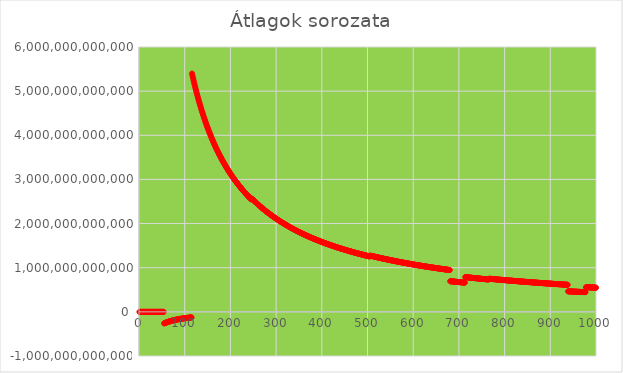
| Category | Series 0 |
|---|---|
| 1.0 | 73.342 |
| 2.0 | -8998038.1 |
| 3.0 | -5999014.146 |
| 4.0 | -4499249.959 |
| 5.0 | -3599421.677 |
| 6.0 | -2999512.402 |
| 7.0 | -2570990.551 |
| 8.0 | -2249607.826 |
| 9.0 | -1999646.416 |
| 10.0 | -1799685.333 |
| 11.0 | -1635960.629 |
| 12.0 | -1498089.171 |
| 13.0 | -1382877.016 |
| 14.0 | -1283683.801 |
| 15.0 | -1198100.523 |
| 16.0 | -1123221.568 |
| 17.0 | -1057045.702 |
| 18.0 | -1591620.521 |
| 19.0 | -1508120.52 |
| 20.0 | -1431346.783 |
| 21.0 | -1363021.76 |
| 22.0 | -1301070.196 |
| 23.0 | -1244540.46 |
| 24.0 | -1192691.345 |
| 25.0 | -1144949.747 |
| 26.0 | -1100864.348 |
| 27.0 | -1058429.316 |
| 28.0 | -844750.14 |
| 29.0 | -815525.965 |
| 30.0 | -788340.503 |
| 31.0 | -762882.119 |
| 32.0 | -739025.991 |
| 33.0 | -716621.884 |
| 34.0 | -695547.17 |
| 35.0 | -675397.177 |
| 36.0 | -656631.612 |
| 37.0 | -638881.057 |
| 38.0 | -622071.281 |
| 39.0 | -606115.889 |
| 40.0 | -590956.231 |
| 41.0 | -577149.42 |
| 42.0 | -562821.652 |
| 43.0 | -549713.29 |
| 44.0 | -537416.353 |
| 45.0 | -500046.419 |
| 46.0 | -489183.406 |
| 47.0 | -478709.487 |
| 48.0 | -468731.911 |
| 49.0 | -459166.902 |
| 50.0 | -448379.593 |
| 51.0 | -488933.9 |
| 52.0 | -479526.282 |
| 53.0 | -470481.327 |
| 54.0 | 4357511.761 |
| 55.0 | -262386377066.262 |
| 56.0 | -257700906052.723 |
| 57.0 | -253179790985.299 |
| 58.0 | -248814622174.234 |
| 59.0 | -244597425189.073 |
| 60.0 | -240520808755.395 |
| 61.0 | -236577021240.015 |
| 62.0 | -232761262849.162 |
| 63.0 | -229066639624.921 |
| 64.0 | -225487473381.436 |
| 65.0 | -222018435329.951 |
| 66.0 | -218654519638.866 |
| 67.0 | -215391064013.237 |
| 68.0 | -212223255084.763 |
| 69.0 | -209147555708.713 |
| 70.0 | -206160170025.491 |
| 71.0 | -203256505662.96 |
| 72.0 | -200433498638.749 |
| 73.0 | -197687834277.686 |
| 74.0 | -195016464765.516 |
| 75.0 | -192416245234.163 |
| 76.0 | -189884452534.172 |
| 77.0 | -187418420682.005 |
| 78.0 | -185015626460.637 |
| 79.0 | -182673656511.588 |
| 80.0 | -180390235806.14 |
| 81.0 | -178163195857.363 |
| 82.0 | -175990473953.347 |
| 83.0 | -173870106796.752 |
| 84.0 | -171800224572.114 |
| 85.0 | -169779045458.839 |
| 86.0 | -167804870508.874 |
| 87.0 | -165876078863.313 |
| 88.0 | -163984975426.407 |
| 89.0 | -162142447567.551 |
| 90.0 | -160340864780.276 |
| 91.0 | -158578877256.064 |
| 92.0 | -156855193833.895 |
| 93.0 | -155168578847.298 |
| 94.0 | -153844998663.005 |
| 95.0 | -152225577626.143 |
| 96.0 | -150639894578.554 |
| 97.0 | -149086905974.069 |
| 98.0 | -147565611012.832 |
| 99.0 | -146075049238.624 |
| 100.0 | -144614298746.612 |
| 101.0 | -143182473925.043 |
| 102.0 | -141778724179.691 |
| 103.0 | -140402231712.903 |
| 104.0 | -139052210254.796 |
| 105.0 | -137727903489.24 |
| 106.0 | -136428583642.183 |
| 107.0 | -135153550252.04 |
| 108.0 | -133902128489.962 |
| 109.0 | -132673678880.621 |
| 110.0 | -131467554507.733 |
| 111.0 | -130283162123.412 |
| 112.0 | -129119919573.157 |
| 113.0 | -127977265429.886 |
| 114.0 | -126854657811.527 |
| 115.0 | -125751573833.98 |
| 116.0 | 5397983727469.142 |
| 117.0 | 5351847114414.734 |
| 118.0 | 5306492478497.487 |
| 119.0 | 5261900104671.265 |
| 120.0 | 5218050937064.551 |
| 121.0 | 5174926549151.6 |
| 122.0 | 5132509118419.924 |
| 123.0 | 5090781402013.877 |
| 124.0 | 5049726713419.926 |
| 125.0 | 5009328899712.873 |
| 126.0 | 4969572321145.022 |
| 127.0 | 4930440337955.985 |
| 128.0 | 4891921272796.426 |
| 129.0 | 4853999755832.431 |
| 130.0 | 4816661379137.787 |
| 131.0 | 4779892971664.072 |
| 132.0 | 4743681661309.508 |
| 133.0 | 4708014881899.278 |
| 134.0 | 4672880442481.731 |
| 135.0 | 4638266513305.288 |
| 136.0 | 4604161612471.637 |
| 137.0 | 4570554593402.205 |
| 138.0 | 4537434632580.184 |
| 139.0 | 4504791217932.449 |
| 140.0 | 4472614137802.77 |
| 141.0 | 4440893470179.281 |
| 142.0 | 4409619572499.104 |
| 143.0 | 4378783071991.268 |
| 144.0 | 4348374856215.236 |
| 145.0 | 4318386064094.248 |
| 146.0 | 4288808077351.957 |
| 147.0 | 4259632512199.34 |
| 148.0 | 4230851211434.974 |
| 149.0 | 4202456236464.265 |
| 150.0 | 4174439861552.498 |
| 151.0 | 4146794564455.012 |
| 152.0 | 4119513021267.414 |
| 153.0 | 4092588099217.041 |
| 154.0 | 4066020023198.587 |
| 155.0 | 4039787635954.171 |
| 156.0 | 4013891561365.581 |
| 157.0 | 3988325372709.927 |
| 158.0 | 3963082807116.288 |
| 159.0 | 3938157758017.227 |
| 160.0 | 3913599908199.745 |
| 161.0 | 3889291834268.379 |
| 162.0 | 3865283836275.48 |
| 163.0 | 3841570438570.354 |
| 164.0 | 3818146232609.882 |
| 165.0 | 3795005952413.116 |
| 166.0 | 3772144470764.542 |
| 167.0 | 3749556776431.381 |
| 168.0 | 3727237987327.398 |
| 169.0 | 3705183324649.391 |
| 170.0 | 3683388128621.533 |
| 171.0 | 3661847847111.803 |
| 172.0 | 3640558034046.778 |
| 173.0 | 3619514345988.398 |
| 174.0 | 3598712539399.7 |
| 175.0 | 3578148467740.106 |
| 176.0 | 3557818078737.189 |
| 177.0 | 3537717411626.007 |
| 178.0 | 3517842592185.361 |
| 179.0 | 3498189840272.44 |
| 180.0 | 3478755452069.682 |
| 181.0 | 3459535808683.952 |
| 182.0 | 3440527370182.572 |
| 183.0 | 3421726674169.874 |
| 184.0 | 3403130333556.752 |
| 185.0 | 3384735034457.412 |
| 186.0 | 3366537534275.806 |
| 187.0 | 3348534659754.692 |
| 188.0 | 3330723305182.617 |
| 189.0 | 3313100430599.858 |
| 190.0 | 3295663059912.712 |
| 191.0 | 3278408268570.162 |
| 192.0 | 3261333225504.036 |
| 193.0 | 3244435125878.041 |
| 194.0 | 3227711233526.853 |
| 195.0 | 3211158868404.302 |
| 196.0 | 3194775404741.436 |
| 197.0 | 3178558270708.042 |
| 198.0 | 3162504946116.596 |
| 199.0 | 3146612961463.102 |
| 200.0 | 3130876446889.433 |
| 201.0 | 3115299943886.097 |
| 202.0 | 3099877666937.98 |
| 203.0 | 3084607278644.933 |
| 204.0 | 3069486664127.23 |
| 205.0 | 3054513558451.238 |
| 206.0 | 3039685822743.598 |
| 207.0 | 3025001367865.056 |
| 208.0 | 3010458092058.43 |
| 209.0 | 2996053986353.41 |
| 210.0 | 2981787062607.752 |
| 211.0 | 2967655370389.846 |
| 212.0 | 2953656996001.612 |
| 213.0 | 2939790062069.989 |
| 214.0 | 2926052752964.064 |
| 215.0 | 2912443205275.602 |
| 216.0 | 2898959672617.344 |
| 217.0 | 2885603853096.646 |
| 218.0 | 2872367138176.392 |
| 219.0 | 2859251306495.66 |
| 220.0 | 2846254709660.978 |
| 221.0 | 2833375733509.001 |
| 222.0 | 2820612779754.172 |
| 223.0 | 2807964291952.398 |
| 224.0 | 2795428734820.246 |
| 225.0 | 2783004607110.114 |
| 226.0 | 2770690427360.097 |
| 227.0 | 2758484742620.754 |
| 228.0 | 2746386125303.002 |
| 229.0 | 2734393172807.052 |
| 230.0 | 2722504507507.942 |
| 231.0 | 2710718773711.181 |
| 232.0 | 2699034641574.998 |
| 233.0 | 2687450801911.046 |
| 234.0 | 2675965969424.045 |
| 235.0 | 2664578880180.584 |
| 236.0 | 2653288291700.229 |
| 237.0 | 2642092982452.686 |
| 238.0 | 2630991751428.846 |
| 239.0 | 2619983417812.022 |
| 240.0 | 2609066820237.095 |
| 241.0 | 2598240812415.546 |
| 242.0 | 2587504280297.222 |
| 243.0 | 2576856114630.326 |
| 244.0 | 2566295227903.886 |
| 245.0 | 2555820553466.376 |
| 246.0 | 2545431039021.766 |
| 247.0 | 2564768930865.873 |
| 248.0 | 2554427120660.556 |
| 249.0 | 2544168377271.131 |
| 250.0 | 2533991703761.744 |
| 251.0 | 2523896097991.576 |
| 252.0 | 2513880637303.108 |
| 253.0 | 2503944350018.5 |
| 254.0 | 2494086301396.686 |
| 255.0 | 2484305570803.765 |
| 256.0 | 2474601252167.584 |
| 257.0 | 2464972461401.27 |
| 258.0 | 2455418304574.277 |
| 259.0 | 2445937924986.912 |
| 260.0 | 2436530402833.291 |
| 261.0 | 2427195037305.387 |
| 262.0 | 2417930934109.443 |
| 263.0 | 2408737280366.741 |
| 264.0 | 2399613275515.969 |
| 265.0 | 2390558131081.08 |
| 266.0 | 2381571070356.842 |
| 267.0 | 2372651328520.498 |
| 268.0 | 2363798152164.029 |
| 269.0 | 2355010800597.302 |
| 270.0 | 2346288538372.21 |
| 271.0 | 2337630647087.338 |
| 272.0 | 2329036416782.69 |
| 273.0 | 2320505147854.29 |
| 274.0 | 2312036153587.129 |
| 275.0 | 2303628749372.106 |
| 276.0 | 2295282268394.304 |
| 277.0 | 2286996050811.569 |
| 278.0 | 2278769446313.469 |
| 279.0 | 2270601813917.55 |
| 280.0 | 2262492521725.552 |
| 281.0 | 2254440947833.048 |
| 282.0 | 2246446753499.216 |
| 283.0 | 2238508779107.078 |
| 284.0 | 2230626705940.878 |
| 285.0 | 2222799945568.715 |
| 286.0 | 2215027917912.764 |
| 287.0 | 2207310050616.452 |
| 288.0 | 2199645617392.599 |
| 289.0 | 2192034385920.852 |
| 290.0 | 2184475646659.401 |
| 291.0 | 2176968857496.887 |
| 292.0 | 2169513484697.657 |
| 293.0 | 2162109001814.576 |
| 294.0 | 2154754887112.224 |
| 295.0 | 2147436394323.688 |
| 296.0 | 2140181541966.119 |
| 297.0 | 2132975543600.007 |
| 298.0 | 2125817907548.151 |
| 299.0 | 2118708148568.608 |
| 300.0 | 2111645788073.234 |
| 301.0 | 2104630287790.575 |
| 302.0 | 2097722413022.237 |
| 303.0 | 2090799236576.394 |
| 304.0 | 2083921606792.54 |
| 305.0 | 2077089032541.218 |
| 306.0 | 2070301159800.599 |
| 307.0 | 2063557505467.542 |
| 308.0 | 2056857643451.932 |
| 309.0 | 2050201146217.658 |
| 310.0 | 2043587594139.289 |
| 311.0 | 2037016572934.343 |
| 312.0 | 2030487670653.681 |
| 313.0 | 2024000489599.132 |
| 314.0 | 2017554628178.845 |
| 315.0 | 2011149692851.431 |
| 316.0 | 2004785295091.542 |
| 317.0 | 1998461051258.559 |
| 318.0 | 1992176582544.025 |
| 319.0 | 1985931514893.847 |
| 320.0 | 1979725478910.567 |
| 321.0 | 1973558109817.272 |
| 322.0 | 1967428990758.899 |
| 323.0 | 1961337876574.23 |
| 324.0 | 1955284364609.046 |
| 325.0 | 1949268105024.578 |
| 326.0 | 1943288754895.08 |
| 327.0 | 1937345975829.956 |
| 328.0 | 1931439433221.534 |
| 329.0 | 1925568714399.344 |
| 330.0 | 1919733657685.824 |
| 331.0 | 1913933858115.642 |
| 332.0 | 1908168997098.807 |
| 333.0 | 1902438759870.165 |
| 334.0 | 1896744287729.766 |
| 335.0 | 1891082364483.052 |
| 336.0 | 1885454143160.648 |
| 337.0 | 1879859326910.412 |
| 338.0 | 1874297612925.042 |
| 339.0 | 1868768712447.358 |
| 340.0 | 1863272333881.189 |
| 341.0 | 1857808192184.058 |
| 342.0 | 1852376004487.094 |
| 343.0 | 1846975491357.143 |
| 344.0 | 1841606376550.632 |
| 345.0 | 1836268387042.716 |
| 346.0 | 1830961252954.969 |
| 347.0 | 1825684707556.366 |
| 348.0 | 1820438487132.822 |
| 349.0 | 1815188329571.586 |
| 350.0 | 1810002077171.247 |
| 351.0 | 1804845375473.727 |
| 352.0 | 1799717973623.124 |
| 353.0 | 1794619622422.74 |
| 354.0 | 1789550075469.154 |
| 355.0 | 1784509089340.464 |
| 356.0 | 1779496423613.761 |
| 357.0 | 1774511839794.366 |
| 358.0 | 1769555102811.869 |
| 359.0 | 1764625979962.704 |
| 360.0 | 1759724241129.191 |
| 361.0 | 1754849658727.57 |
| 362.0 | 1750002007738.014 |
| 363.0 | 1745181072868.02 |
| 364.0 | 1740386619371.256 |
| 365.0 | 1735618434119.22 |
| 366.0 | 1730876307249.609 |
| 367.0 | 1726160023033.432 |
| 368.0 | 1721469370801.174 |
| 369.0 | 1716804142154.139 |
| 370.0 | 1712164130959.405 |
| 371.0 | 1707549133571.436 |
| 372.0 | 1702958947728.659 |
| 373.0 | 1698393374142.644 |
| 374.0 | 1693852215388.088 |
| 375.0 | 1689335276146.924 |
| 376.0 | 1684842363178.072 |
| 377.0 | 1680373285291.53 |
| 378.0 | 1675927853323.29 |
| 379.0 | 1671505880000.44 |
| 380.0 | 1667095279737.652 |
| 381.0 | 1662719701575.081 |
| 382.0 | 1658367032199.4 |
| 383.0 | 1654037092168.224 |
| 384.0 | 1649729703923.768 |
| 385.0 | 1645444697332.129 |
| 386.0 | 1641181887236.101 |
| 387.0 | 1636941107102.062 |
| 388.0 | 1632722186814.764 |
| 389.0 | 1628524957543.318 |
| 390.0 | 1624344505246.302 |
| 391.0 | 1620189607919.889 |
| 392.0 | 1616056471165.123 |
| 393.0 | 1611944368075.876 |
| 394.0 | 1607853138716.927 |
| 395.0 | 1603782626364.268 |
| 396.0 | 1599732656337.475 |
| 397.0 | 1595703103046.749 |
| 398.0 | 1591693798751.591 |
| 399.0 | 1587704591235.813 |
| 400.0 | 1583735329757.932 |
| 401.0 | 1579785865095.082 |
| 402.0 | 1575856048567.197 |
| 403.0 | 1571945735795.886 |
| 404.0 | 1568054781003.474 |
| 405.0 | 1564183196652.079 |
| 406.0 | 1560330528679.838 |
| 407.0 | 1556496792736.68 |
| 408.0 | 1552681849585.264 |
| 409.0 | 1548885561385.47 |
| 410.0 | 1545107789156.483 |
| 411.0 | 1541348402805.609 |
| 412.0 | 1537607265905.496 |
| 413.0 | 1533884245873.795 |
| 414.0 | 1530613185482.69 |
| 415.0 | 1526924960938.615 |
| 416.0 | 1523254468250.756 |
| 417.0 | 1519601579935.001 |
| 418.0 | 1515966169455.222 |
| 419.0 | 1512348111772.216 |
| 420.0 | 1508747285698.353 |
| 421.0 | 1505163562992.411 |
| 422.0 | 1501596824692.308 |
| 423.0 | 1498046950381.701 |
| 424.0 | 1494513820780.612 |
| 425.0 | 1490997317672.79 |
| 426.0 | 1487497323969.478 |
| 427.0 | 1484013723662.732 |
| 428.0 | 1480546401685.472 |
| 429.0 | 1477095244571.671 |
| 430.0 | 1473660139332.906 |
| 431.0 | 1470240974275.552 |
| 432.0 | 1466837638694.358 |
| 433.0 | 1463450022900.122 |
| 434.0 | 1460077121124.625 |
| 435.0 | 1456720621995.818 |
| 436.0 | 1453379519669.22 |
| 437.0 | 1450053709052.778 |
| 438.0 | 1446743084146.38 |
| 439.0 | 1443447541815.406 |
| 440.0 | 1440166979220.732 |
| 441.0 | 1436901294239.186 |
| 442.0 | 1433650386373.023 |
| 443.0 | 1430414154672.335 |
| 444.0 | 1427192501171.242 |
| 445.0 | 1423985326988.814 |
| 446.0 | 1420792534809.414 |
| 447.0 | 1417614028004.997 |
| 448.0 | 1414449710976.056 |
| 449.0 | 1411299488904.477 |
| 450.0 | 1408163231578.41 |
| 451.0 | 1405040918426.465 |
| 452.0 | 1401932420822.705 |
| 453.0 | 1398837647265.896 |
| 454.0 | 1395756508749.116 |
| 455.0 | 1392688911994.651 |
| 456.0 | 1389634769643.21 |
| 457.0 | 1386593993341.736 |
| 458.0 | 1383566495539.992 |
| 459.0 | 1380552189448.95 |
| 460.0 | 1377550990423.711 |
| 461.0 | 1374562810400.501 |
| 462.0 | 1371587566221.774 |
| 463.0 | 1368625174067.588 |
| 464.0 | 1365675554519.104 |
| 465.0 | 1362738617827.061 |
| 466.0 | 1359814287515.756 |
| 467.0 | 1356902479451.113 |
| 468.0 | 1354003115182.906 |
| 469.0 | 1351116114933.584 |
| 470.0 | 1348241400385.479 |
| 471.0 | 1345378892104.297 |
| 472.0 | 1342528513104.192 |
| 473.0 | 1339690186438.568 |
| 474.0 | 1336863835845.883 |
| 475.0 | 1334049385524.969 |
| 476.0 | 1331246760765.256 |
| 477.0 | 1328455887040.961 |
| 478.0 | 1325676690956.205 |
| 479.0 | 1322909098872.188 |
| 480.0 | 1320153038245.626 |
| 481.0 | 1317408437334.638 |
| 482.0 | 1314675224424.842 |
| 483.0 | 1311953329550.16 |
| 484.0 | 1309242682174.945 |
| 485.0 | 1306543212728.152 |
| 486.0 | 1303854852205.114 |
| 487.0 | 1301177532180.643 |
| 488.0 | 1298512958491.621 |
| 489.0 | 1295857512768.557 |
| 490.0 | 1293212905596.186 |
| 491.0 | 1290579070890.12 |
| 492.0 | 1287955942697.422 |
| 493.0 | 1285343455999.864 |
| 494.0 | 1282741546170.715 |
| 495.0 | 1280150149106.576 |
| 496.0 | 1277569201225.521 |
| 497.0 | 1274998639452.762 |
| 498.0 | 1272438401221.056 |
| 499.0 | 1269888424464.47 |
| 500.0 | 1267348647615.987 |
| 501.0 | 1264819009612.35 |
| 502.0 | 1262330439162.158 |
| 503.0 | 1259820835903.695 |
| 504.0 | 1257321191392.295 |
| 505.0 | 1254831446458.72 |
| 506.0 | 1273962191770.737 |
| 507.0 | 1271449445830.475 |
| 508.0 | 1268946592577.475 |
| 509.0 | 1266453573727.13 |
| 510.0 | 1263970331424.751 |
| 511.0 | 1261496808286.142 |
| 512.0 | 1259032947332.565 |
| 513.0 | 1256578692143.526 |
| 514.0 | 1254133986516.674 |
| 515.0 | 1251698774891.626 |
| 516.0 | 1249273002077.995 |
| 517.0 | 1246856613292.244 |
| 518.0 | 1244449554193.07 |
| 519.0 | 1242051770851.987 |
| 520.0 | 1239663209749.53 |
| 521.0 | 1237283817792.404 |
| 522.0 | 1234913542279.538 |
| 523.0 | 1232552330917.55 |
| 524.0 | 1230200131813.004 |
| 525.0 | 1227856903334.398 |
| 526.0 | 1225522574620.451 |
| 527.0 | 1223197104839.311 |
| 528.0 | 1220880443653.867 |
| 529.0 | 1218572541200.403 |
| 530.0 | 1216273347724.759 |
| 531.0 | 1213982814115.262 |
| 532.0 | 1211700891531.226 |
| 533.0 | 1209427531508.38 |
| 534.0 | 1207162685943.842 |
| 535.0 | 1204906308191.369 |
| 536.0 | 1202658348588.884 |
| 537.0 | 1200418761348.163 |
| 538.0 | 1198187485341.89 |
| 539.0 | 1195964502994.188 |
| 540.0 | 1193749753913.726 |
| 541.0 | 1191543192445.152 |
| 542.0 | 1189344773273.959 |
| 543.0 | 1187154451381.456 |
| 544.0 | 1184972182168.528 |
| 545.0 | 1182797921429.949 |
| 546.0 | 1180631624874.101 |
| 547.0 | 1178473249068.412 |
| 548.0 | 1176322750437.514 |
| 549.0 | 1174180086046.134 |
| 550.0 | 1172045213162.685 |
| 551.0 | 1169918089365.726 |
| 552.0 | 1167798672537.031 |
| 553.0 | 1165686920868.428 |
| 554.0 | 1163582792852.55 |
| 555.0 | 1161486247278.584 |
| 556.0 | 1159397243236.646 |
| 557.0 | 1157315740106.524 |
| 558.0 | 1155241697561.962 |
| 559.0 | 1153175075563.118 |
| 560.0 | 1151115834356.819 |
| 561.0 | 1149063934474.621 |
| 562.0 | 1147019336727.315 |
| 563.0 | 1144982003204.82 |
| 564.0 | 1142951893269.689 |
| 565.0 | 1140928969564.471 |
| 566.0 | 1138913193998.247 |
| 567.0 | 1136904528743.547 |
| 568.0 | 1134902936259.418 |
| 569.0 | 1132908379251.176 |
| 570.0 | 1130920820664.79 |
| 571.0 | 1128940223781.042 |
| 572.0 | 1126966552056.266 |
| 573.0 | 1124999769241.496 |
| 574.0 | 1123039839330.602 |
| 575.0 | 1121086726566.606 |
| 576.0 | 1119140286894.25 |
| 577.0 | 1117200702341.778 |
| 578.0 | 1115267805628.668 |
| 579.0 | 1113341609072.826 |
| 580.0 | 1111422054574.532 |
| 581.0 | 1109509082489.978 |
| 582.0 | 1107602709497.049 |
| 583.0 | 1105702876199.025 |
| 584.0 | 1103809549421.821 |
| 585.0 | 1101924914622.141 |
| 586.0 | 1100044496688.912 |
| 587.0 | 1098170485621.636 |
| 588.0 | 1096302848741.261 |
| 589.0 | 1094441553577.725 |
| 590.0 | 1092586567893.59 |
| 591.0 | 1090737902418.836 |
| 592.0 | 1088895383550.543 |
| 593.0 | 1086856530261.449 |
| 594.0 | 1085026805470.634 |
| 595.0 | 1083203231005.711 |
| 596.0 | 1081385775818.157 |
| 597.0 | 1079574409252.094 |
| 598.0 | 1077769100821.079 |
| 599.0 | 1075969820185.177 |
| 600.0 | 1074176537151.089 |
| 601.0 | 1072389221731.496 |
| 602.0 | 1070607844260.669 |
| 603.0 | 1068832375199.203 |
| 604.0 | 1067062785184.864 |
| 605.0 | 1065299046423.6 |
| 606.0 | 1063541127204.366 |
| 607.0 | 1061789000149.629 |
| 608.0 | 1060042636662.475 |
| 609.0 | 1058302008358.256 |
| 610.0 | 1056567061890.076 |
| 611.0 | 1054837820173.019 |
| 612.0 | 1053114228812.043 |
| 613.0 | 1051396261062.646 |
| 614.0 | 1049683889301.75 |
| 615.0 | 1047977086006.4 |
| 616.0 | 1046275824505.237 |
| 617.0 | 1044580077625.826 |
| 618.0 | 1042889818759.346 |
| 619.0 | 1041205021008.037 |
| 620.0 | 1039525657682.943 |
| 621.0 | 1037851703319.739 |
| 622.0 | 1036183131452.664 |
| 623.0 | 1034519916153.898 |
| 624.0 | 1032862031672.553 |
| 625.0 | 1031209452421.668 |
| 626.0 | 1029562142934.125 |
| 627.0 | 1027920098048.946 |
| 628.0 | 1026283190882.082 |
| 629.0 | 1024651481784.282 |
| 630.0 | 1023025050862.3 |
| 631.0 | 1021403775028.69 |
| 632.0 | 1019787629815.143 |
| 633.0 | 1018176590906.074 |
| 634.0 | 1016570634132.92 |
| 635.0 | 1014969735497.728 |
| 636.0 | 1013373872432.222 |
| 637.0 | 1011783018620.187 |
| 638.0 | 1010197151820.008 |
| 639.0 | 1008616248607.076 |
| 640.0 | 1007040285710.695 |
| 641.0 | 1005469240023.265 |
| 642.0 | 1003903088596.232 |
| 643.0 | 1002341808520.531 |
| 644.0 | 1000785377007.16 |
| 645.0 | 999233771771.435 |
| 646.0 | 997686970271.946 |
| 647.0 | 996144950224.467 |
| 648.0 | 994607689498.352 |
| 649.0 | 993075166093.826 |
| 650.0 | 991547357798.681 |
| 651.0 | 990024243736.733 |
| 652.0 | 988505801645.168 |
| 653.0 | 986992010217.962 |
| 654.0 | 985482848122.912 |
| 655.0 | 983978294574.49 |
| 656.0 | 982478327625.218 |
| 657.0 | 980982926821.966 |
| 658.0 | 979492071175.832 |
| 659.0 | 978005740263.748 |
| 660.0 | 976523913317.994 |
| 661.0 | 975046563605.345 |
| 662.0 | 973573683599.752 |
| 663.0 | 972105246671.068 |
| 664.0 | 970641232737.676 |
| 665.0 | 969181621862.946 |
| 666.0 | 967726394201.339 |
| 667.0 | 966275530041.863 |
| 668.0 | 964829009787.25 |
| 669.0 | 963386813958.211 |
| 670.0 | 961948923188.73 |
| 671.0 | 960556592990.85 |
| 672.0 | 959127193299.194 |
| 673.0 | 957702040509.376 |
| 674.0 | 956281117600.886 |
| 675.0 | 954864404838.822 |
| 676.0 | 953451883528.875 |
| 677.0 | 952043535100.323 |
| 678.0 | 950639340754.733 |
| 679.0 | 949239282815.54 |
| 680.0 | 947843342693.67 |
| 681.0 | 693500663028.834 |
| 682.0 | 692483799578.022 |
| 683.0 | 691469914070.238 |
| 684.0 | 690459183389.008 |
| 685.0 | 689451213790.817 |
| 686.0 | 688446182930.409 |
| 687.0 | 687444077863.276 |
| 688.0 | 686444885888.467 |
| 689.0 | 685448594320.03 |
| 690.0 | 684455190560.091 |
| 691.0 | 683464662062.313 |
| 692.0 | 682476996365.436 |
| 693.0 | 681492181373.77 |
| 694.0 | 680510204350.04 |
| 695.0 | 679531052981.614 |
| 696.0 | 678554715260.542 |
| 697.0 | 677581178643.427 |
| 698.0 | 676610428730.495 |
| 699.0 | 675642459637.818 |
| 700.0 | 674677256124.102 |
| 701.0 | 673733051315.281 |
| 702.0 | 672773317623.868 |
| 703.0 | 671816314327.026 |
| 704.0 | 670862029796.827 |
| 705.0 | 669910452449.525 |
| 706.0 | 668961570788.533 |
| 707.0 | 668015373375.621 |
| 708.0 | 667071848850.254 |
| 709.0 | 666130985871.639 |
| 710.0 | 665192773220.394 |
| 711.0 | 664257199719.427 |
| 712.0 | 663326388114.981 |
| 713.0 | 662396041620.549 |
| 714.0 | 787054155619.51 |
| 715.0 | 785953380576.597 |
| 716.0 | 784855680324.303 |
| 717.0 | 783761041996.763 |
| 718.0 | 782669452791.418 |
| 719.0 | 781580900173.803 |
| 720.0 | 780495371145.231 |
| 721.0 | 779412853293.383 |
| 722.0 | 778333334106.281 |
| 723.0 | 777256801140.798 |
| 724.0 | 776183242022.912 |
| 725.0 | 775112644448.424 |
| 726.0 | 774044996178.669 |
| 727.0 | 772980285044.568 |
| 728.0 | 771918498938.678 |
| 729.0 | 770859625809.329 |
| 730.0 | 769803456198.204 |
| 731.0 | 768750373495.049 |
| 732.0 | 767700168066.39 |
| 733.0 | 766652828066.728 |
| 734.0 | 765608341976.132 |
| 735.0 | 764566697973.858 |
| 736.0 | 763527884525.145 |
| 737.0 | 762491890147.538 |
| 738.0 | 761458703304.982 |
| 739.0 | 760428312639.034 |
| 740.0 | 759400706802.226 |
| 741.0 | 758375874539.466 |
| 742.0 | 757353695192.1 |
| 743.0 | 756334376625.166 |
| 744.0 | 755317798257.445 |
| 745.0 | 753096661448.869 |
| 746.0 | 752087147951.017 |
| 747.0 | 751080337846.441 |
| 748.0 | 750076219747.984 |
| 749.0 | 749074782872.552 |
| 750.0 | 748076016495.477 |
| 751.0 | 747079909932.005 |
| 752.0 | 746086452605.482 |
| 753.0 | 745095633943.234 |
| 754.0 | 744107443445.227 |
| 755.0 | 743121870668.497 |
| 756.0 | 742138905231.285 |
| 757.0 | 741158536795.644 |
| 758.0 | 740180755083.055 |
| 759.0 | 739205549911.845 |
| 760.0 | 738232911030.452 |
| 761.0 | 737262828362.228 |
| 762.0 | 736295291842.008 |
| 763.0 | 735330291465.844 |
| 764.0 | 734367817253.266 |
| 765.0 | 733407859329.818 |
| 766.0 | 750775522414.031 |
| 767.0 | 749796675579.029 |
| 768.0 | 748820377823.561 |
| 769.0 | 747846619204.292 |
| 770.0 | 746875389828.882 |
| 771.0 | 745906679847.411 |
| 772.0 | 744940479482.614 |
| 773.0 | 743976778991.488 |
| 774.0 | 743015568715.811 |
| 775.0 | 742056838949.88 |
| 776.0 | 741100580134.38 |
| 777.0 | 740146782734.045 |
| 778.0 | 739195437260.889 |
| 779.0 | 738246534443.073 |
| 780.0 | 737300064527.068 |
| 781.0 | 736356018346.912 |
| 782.0 | 735414386399.653 |
| 783.0 | 734475154084.747 |
| 784.0 | 733538323536.355 |
| 785.0 | 732603879811.802 |
| 786.0 | 731671813804.969 |
| 787.0 | 730742116453.673 |
| 788.0 | 729814778742.138 |
| 789.0 | 728889791676.878 |
| 790.0 | 727967146376.734 |
| 791.0 | 727046833945.26 |
| 792.0 | 726128844863.718 |
| 793.0 | 725213172071.898 |
| 794.0 | 724299710779.524 |
| 795.0 | 723388641961.311 |
| 796.0 | 722479878164.912 |
| 797.0 | 721573378437.761 |
| 798.0 | 720669151150.313 |
| 799.0 | 719767187256.392 |
| 800.0 | 718867478268.672 |
| 801.0 | 717970076931.936 |
| 802.0 | 717074852369.147 |
| 803.0 | 716181857534.371 |
| 804.0 | 715291084079.636 |
| 805.0 | 714402523726.803 |
| 806.0 | 713516344241.039 |
| 807.0 | 712632185202.405 |
| 808.0 | 711750214675.966 |
| 809.0 | 710870448599.959 |
| 810.0 | 709992830762.753 |
| 811.0 | 709117377210.699 |
| 812.0 | 708244079949.394 |
| 813.0 | 707372931019.48 |
| 814.0 | 706503922504.644 |
| 815.0 | 705637046534.775 |
| 816.0 | 704772295250.047 |
| 817.0 | 703909660871.176 |
| 818.0 | 703049135612.944 |
| 819.0 | 702190711759.602 |
| 820.0 | 701334381623.594 |
| 821.0 | 700480137552.783 |
| 822.0 | 699627971934.681 |
| 823.0 | 698777877193.714 |
| 824.0 | 697929845789.399 |
| 825.0 | 697083870198.589 |
| 826.0 | 696239942993.976 |
| 827.0 | 695398056726.299 |
| 828.0 | 694558204011.979 |
| 829.0 | 693720377469.293 |
| 830.0 | 692884569787.315 |
| 831.0 | 692050773666.519 |
| 832.0 | 691218981890.268 |
| 833.0 | 690389187669.95 |
| 834.0 | 689561397059.722 |
| 835.0 | 688735575025.848 |
| 836.0 | 687911728644.178 |
| 837.0 | 687089850832.133 |
| 838.0 | 686269934542.281 |
| 839.0 | 685451972760.779 |
| 840.0 | 684635958506.501 |
| 841.0 | 683821884833.848 |
| 842.0 | 683009744828.042 |
| 843.0 | 682199531607.716 |
| 844.0 | 681391214405.398 |
| 845.0 | 680581772392.101 |
| 846.0 | 679777302211.854 |
| 847.0 | 678974731607.561 |
| 848.0 | 678174053857.986 |
| 849.0 | 677375262274.952 |
| 850.0 | 676578350201.887 |
| 851.0 | 675783311017.598 |
| 852.0 | 674990138117.292 |
| 853.0 | 674198824067.646 |
| 854.0 | 673409364086.241 |
| 855.0 | 672621750795.25 |
| 856.0 | 671835977717.552 |
| 857.0 | 671052038157.732 |
| 858.0 | 670269926224.382 |
| 859.0 | 669489636360.774 |
| 860.0 | 668711160057.909 |
| 861.0 | 667934492044.674 |
| 862.0 | 667159634594.414 |
| 863.0 | 666386564335.581 |
| 864.0 | 665615283589.768 |
| 865.0 | 664845786147.166 |
| 866.0 | 664078065839.892 |
| 867.0 | 663312116496.715 |
| 868.0 | 662547932031.661 |
| 869.0 | 661785506432.535 |
| 870.0 | 661024834358.168 |
| 871.0 | 660266760206.397 |
| 872.0 | 659509361171.297 |
| 873.0 | 658753909476.889 |
| 874.0 | 658000178688.414 |
| 875.0 | 657248178484.883 |
| 876.0 | 656497895176.239 |
| 877.0 | 655749322889.93 |
| 878.0 | 655002455779.529 |
| 879.0 | 654257272959.593 |
| 880.0 | 653513798785.198 |
| 881.0 | 652772012406.439 |
| 882.0 | 652031908086.503 |
| 883.0 | 651293480103.648 |
| 884.0 | 650556722788.938 |
| 885.0 | 649821630479.22 |
| 886.0 | 649088196178.194 |
| 887.0 | 648356416743.214 |
| 888.0 | 647626285643.358 |
| 889.0 | 646897797132.578 |
| 890.0 | 646170945639.761 |
| 891.0 | 645445726991.219 |
| 892.0 | 644722133119.716 |
| 893.0 | 644000159846.3 |
| 894.0 | 643279801725.389 |
| 895.0 | 642561053343.024 |
| 896.0 | 641843993884.219 |
| 897.0 | 641128446881.218 |
| 898.0 | 640414495381.436 |
| 899.0 | 639702132716.656 |
| 900.0 | 638991350522.72 |
| 901.0 | 638282148135.172 |
| 902.0 | 637574518259.146 |
| 903.0 | 636868455669.756 |
| 904.0 | 636163955155.958 |
| 905.0 | 635461011557.408 |
| 906.0 | 634759619710.243 |
| 907.0 | 634059774483.966 |
| 908.0 | 633361470767.335 |
| 909.0 | 632664703472.677 |
| 910.0 | 631969494730.924 |
| 911.0 | 631275788010.094 |
| 912.0 | 630583599646.094 |
| 913.0 | 629892927576.276 |
| 914.0 | 629203766824.053 |
| 915.0 | 628516112431.669 |
| 916.0 | 627829959470.31 |
| 917.0 | 627145303026.38 |
| 918.0 | 626462138219.45 |
| 919.0 | 625780460158.203 |
| 920.0 | 625100264005.155 |
| 921.0 | 624421540370.466 |
| 922.0 | 623744293577.261 |
| 923.0 | 623068514948.366 |
| 924.0 | 622394198373.82 |
| 925.0 | 621721339781.039 |
| 926.0 | 621049934434.557 |
| 927.0 | 620379977676.796 |
| 928.0 | 619711464769.683 |
| 929.0 | 619044391153.307 |
| 930.0 | 618378745970.697 |
| 931.0 | 617714536791.391 |
| 932.0 | 617051752929.981 |
| 933.0 | 616390389860.405 |
| 934.0 | 615730442977.479 |
| 935.0 | 615071747433.493 |
| 936.0 | 614414619494.469 |
| 937.0 | 613758894204.76 |
| 938.0 | 613104567025.472 |
| 939.0 | 465329107876.825 |
| 940.0 | 464834076820.422 |
| 941.0 | 464340097992.942 |
| 942.0 | 463847167952.417 |
| 943.0 | 463355283368.163 |
| 944.0 | 462864440906.872 |
| 945.0 | 461977881009.693 |
| 946.0 | 461489532305.43 |
| 947.0 | 461002214953.376 |
| 948.0 | 460515925695.79 |
| 949.0 | 460030661293.857 |
| 950.0 | 459546418492.23 |
| 951.0 | 459063193744.578 |
| 952.0 | 458580984507.281 |
| 953.0 | 458099787251.722 |
| 954.0 | 457619598795.407 |
| 955.0 | 457140415954.027 |
| 956.0 | 456662235608.851 |
| 957.0 | 456185054593.008 |
| 958.0 | 455708869775.585 |
| 959.0 | 455233678044.663 |
| 960.0 | 454759554829.991 |
| 961.0 | 454286339892.652 |
| 962.0 | 453814108821.781 |
| 963.0 | 453342863530.587 |
| 964.0 | 452872590848.54 |
| 965.0 | 452403292738.198 |
| 966.0 | 451934966144.249 |
| 967.0 | 451467608134.401 |
| 968.0 | 451001216022.725 |
| 969.0 | 450535786491.281 |
| 970.0 | 450071316004.721 |
| 971.0 | 449607802802.658 |
| 972.0 | 449145243341.615 |
| 973.0 | 448683634663.791 |
| 974.0 | 448372857585.202 |
| 975.0 | 447912987980.566 |
| 976.0 | 447454060728.973 |
| 977.0 | 446996072948.929 |
| 978.0 | 558561595308.484 |
| 979.0 | 557991052310.159 |
| 980.0 | 557421696305.078 |
| 981.0 | 556853478470.01 |
| 982.0 | 556286417901.071 |
| 983.0 | 555720471041.022 |
| 984.0 | 555155714464.387 |
| 985.0 | 555871920426.4 |
| 986.0 | 555308155801.185 |
| 987.0 | 554745548634.146 |
| 988.0 | 554184065294.208 |
| 989.0 | 553623717401.946 |
| 990.0 | 553064501528.16 |
| 991.0 | 552506414245.914 |
| 992.0 | 551949452127.426 |
| 993.0 | 551393611792.912 |
| 994.0 | 550838889849.394 |
| 995.0 | 550285282924.86 |
| 996.0 | 549732788028.596 |
| 997.0 | 549181401080.036 |
| 998.0 | 548631119112.671 |
| 999.0 | 548081938813.174 |
| 1000.0 | 547533856872.976 |